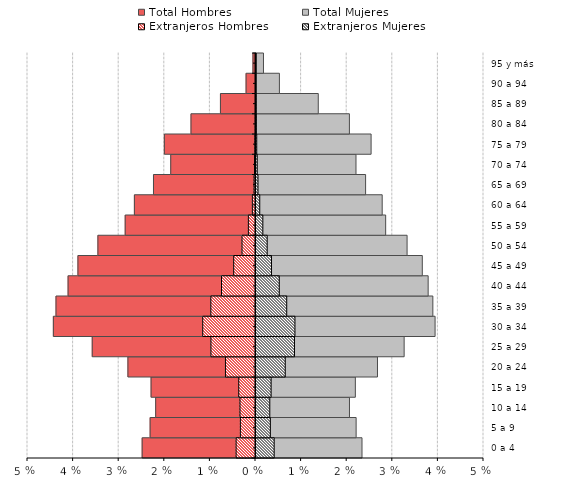
| Category | Total Hombres | Total Mujeres | Extranjeros Hombres | Extranjeros Mujeres |
|---|---|---|---|---|
| 0 a 4 | -0.025 | 0.023 | -0.004 | 0.004 |
| 5 a 9 | -0.023 | 0.022 | -0.003 | 0.003 |
| 10 a 14 | -0.022 | 0.02 | -0.003 | 0.003 |
| 15 a 19 | -0.023 | 0.022 | -0.004 | 0.003 |
| 20 a 24 | -0.028 | 0.027 | -0.007 | 0.006 |
| 25 a 29 | -0.036 | 0.032 | -0.01 | 0.008 |
| 30 a 34 | -0.044 | 0.039 | -0.012 | 0.009 |
| 35 a 39 | -0.044 | 0.039 | -0.01 | 0.007 |
| 40 a 44 | -0.041 | 0.038 | -0.007 | 0.005 |
| 45 a 49 | -0.039 | 0.036 | -0.005 | 0.003 |
| 50 a 54 | -0.035 | 0.033 | -0.003 | 0.002 |
| 55 a 59 | -0.029 | 0.028 | -0.002 | 0.002 |
| 60 a 64 | -0.027 | 0.028 | -0.001 | 0.001 |
| 65 a 69 | -0.022 | 0.024 | 0 | 0 |
| 70 a 74 | -0.019 | 0.022 | 0 | 0 |
| 75 a 79 | -0.02 | 0.025 | 0 | 0 |
| 80 a 84 | -0.014 | 0.02 | 0 | 0 |
| 85 a 89 | -0.008 | 0.014 | 0 | 0 |
| 90 a 94 | -0.002 | 0.005 | 0 | 0 |
| 95 y más | -0.001 | 0.002 | 0 | 0 |